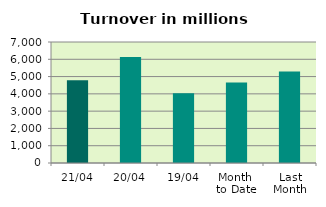
| Category | Series 0 |
|---|---|
| 21/04 | 4784.064 |
| 20/04 | 6127.701 |
| 19/04 | 4040.568 |
| Month 
to Date | 4659.793 |
| Last
Month | 5289.077 |